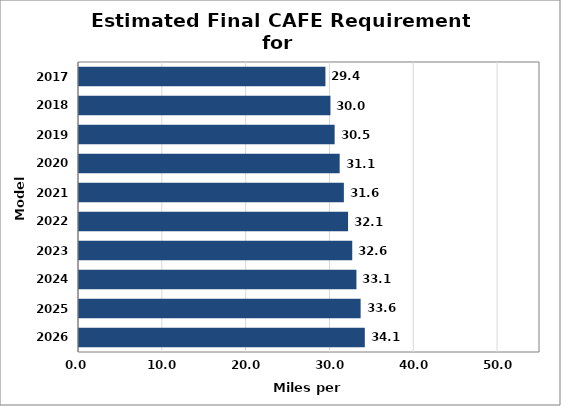
| Category | Series 0 |
|---|---|
| 2026.0 | 34.1 |
| 2025.0 | 33.6 |
| 2024.0 | 33.1 |
| 2023.0 | 32.6 |
| 2022.0 | 32.1 |
| 2021.0 | 31.6 |
| 2020.0 | 31.1 |
| 2019.0 | 30.5 |
| 2018.0 | 30 |
| 2017.0 | 29.4 |